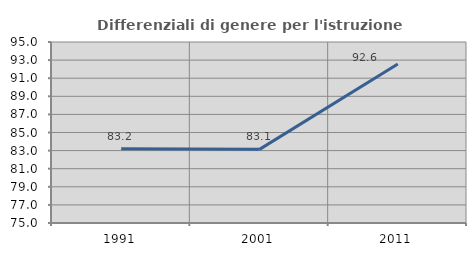
| Category | Differenziali di genere per l'istruzione superiore |
|---|---|
| 1991.0 | 83.217 |
| 2001.0 | 83.135 |
| 2011.0 | 92.563 |